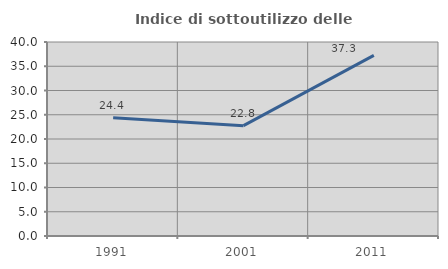
| Category | Indice di sottoutilizzo delle abitazioni  |
|---|---|
| 1991.0 | 24.397 |
| 2001.0 | 22.754 |
| 2011.0 | 37.255 |